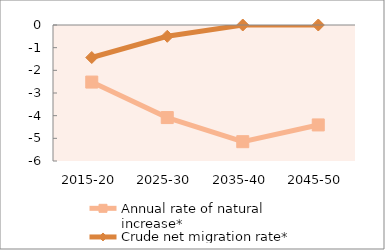
| Category | Annual rate of natural increase* | Crude net migration rate* |
|---|---|---|
| 2015-20 | -2.518 | -1.434 |
| 2025-30 | -4.084 | -0.498 |
| 2035-40 | -5.148 | 0 |
| 2045-50 | -4.409 | 0 |